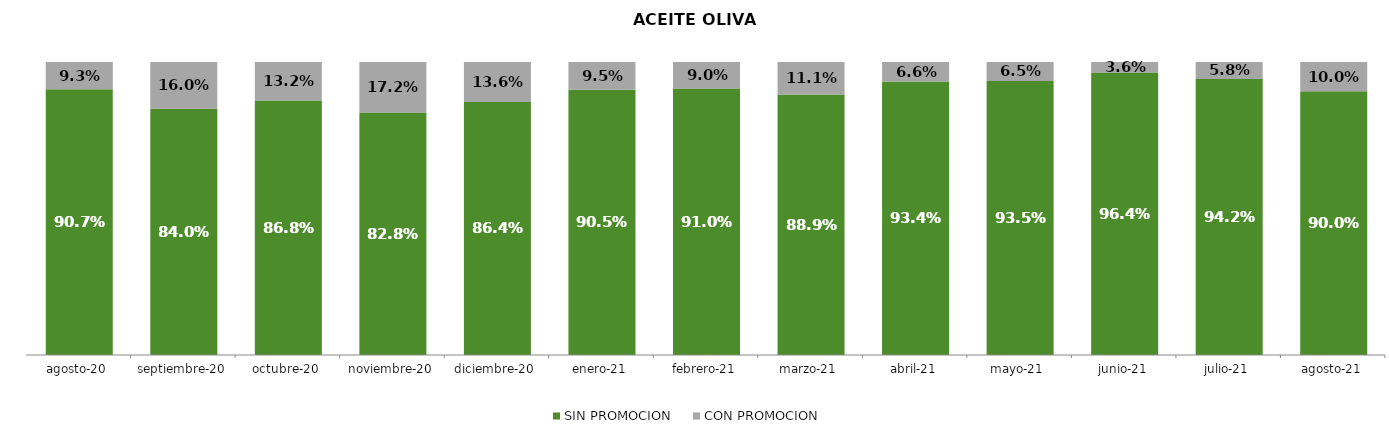
| Category | SIN PROMOCION   | CON PROMOCION   |
|---|---|---|
| 2020-08-01 | 0.907 | 0.093 |
| 2020-09-01 | 0.84 | 0.16 |
| 2020-10-01 | 0.868 | 0.132 |
| 2020-11-01 | 0.828 | 0.172 |
| 2020-12-01 | 0.864 | 0.136 |
| 2021-01-01 | 0.905 | 0.095 |
| 2021-02-01 | 0.91 | 0.09 |
| 2021-03-01 | 0.889 | 0.111 |
| 2021-04-01 | 0.934 | 0.066 |
| 2021-05-01 | 0.935 | 0.065 |
| 2021-06-01 | 0.964 | 0.036 |
| 2021-07-01 | 0.942 | 0.058 |
| 2021-08-01 | 0.9 | 0.1 |